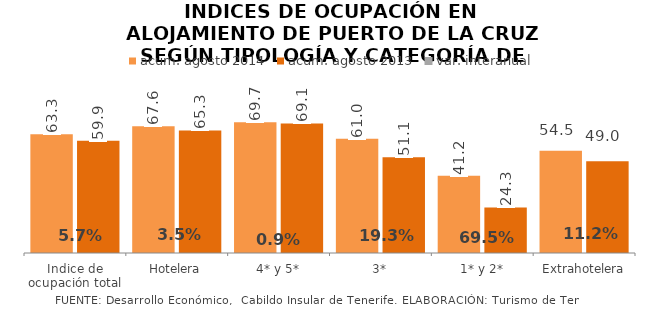
| Category | acum. agosto 2014 | acum. agosto 2013 |
|---|---|---|
| Indice de ocupación total | 63.341 | 59.927 |
| Hotelera | 67.644 | 65.348 |
| 4* y 5* | 69.72 | 69.117 |
| 3* | 60.993 | 51.132 |
| 1* y 2* | 41.157 | 24.279 |
| Extrahotelera | 54.487 | 48.988 |